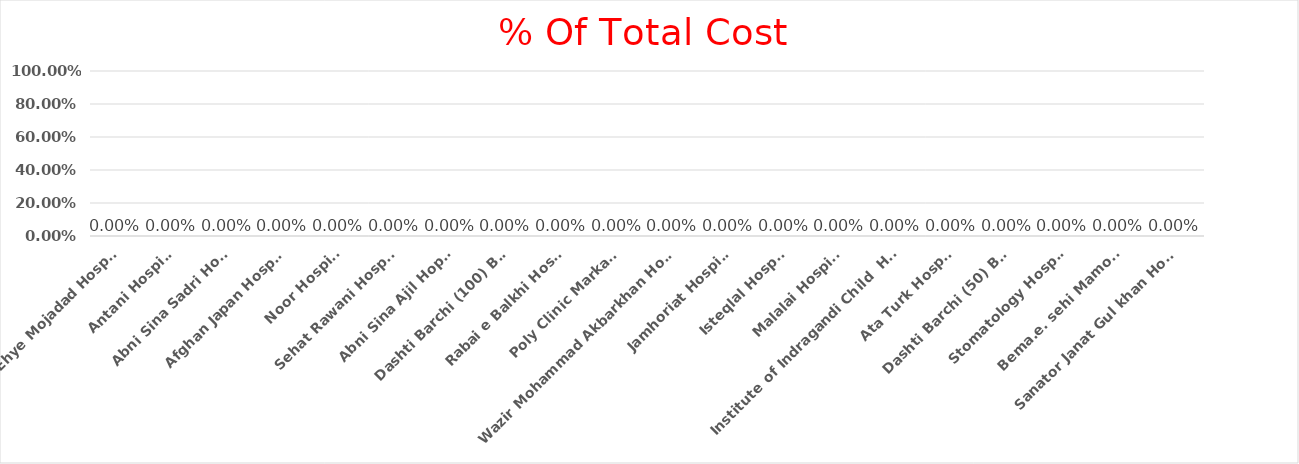
| Category | % Of Total Cost |
|---|---|
| Ehye Mojadad Hospital | 0 |
| Antani Hospital | 0 |
| Abni Sina Sadri Hopital | 0 |
| Afghan Japan Hospital | 0 |
| Noor Hospital | 0 |
| Sehat Rawani Hospital | 0 |
| Abni Sina Ajil Hopital | 0 |
| Dashti Barchi (100) Beds | 0 |
| Rabai e Balkhi Hospital | 0 |
| Poly Clinic Markazee | 0 |
| Wazir Mohammad Akbarkhan Hospital | 0 |
| Jamhoriat Hospital  | 0 |
| Isteqlal Hospital | 0 |
| Malalai Hospital | 0 |
| Institute of Indragandi Child  Health | 0 |
| Ata Turk Hospital | 0 |
| Dashti Barchi (50) Beds | 0 |
| Stomatology Hospital | 0 |
| Bema.e. sehi Mamoorin | 0 |
| Sanator Janat Gul khan Hopital | 0 |